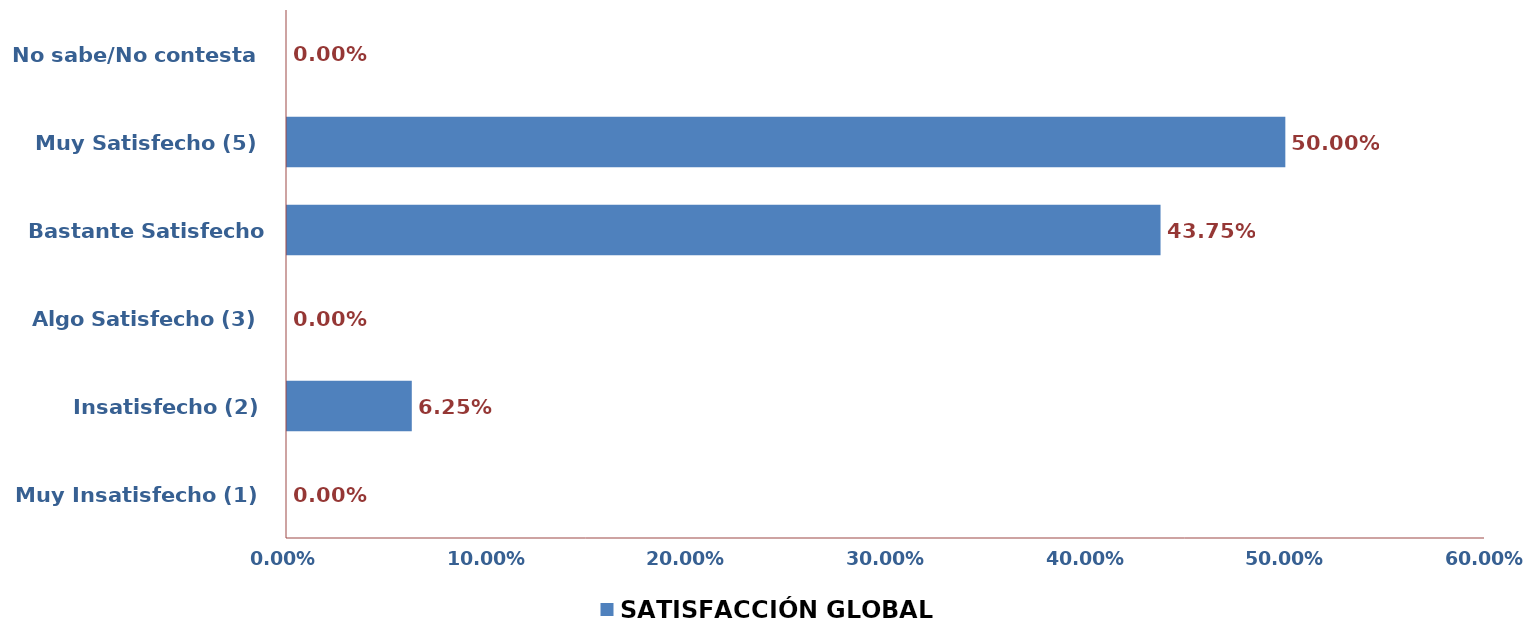
| Category | SATISFACCIÓN GLOBAL |
|---|---|
| Muy Insatisfecho (1) | 0 |
| Insatisfecho (2) | 0.062 |
| Algo Satisfecho (3) | 0 |
| Bastante Satisfecho (4) | 0.438 |
| Muy Satisfecho (5) | 0.5 |
| No sabe/No contesta | 0 |